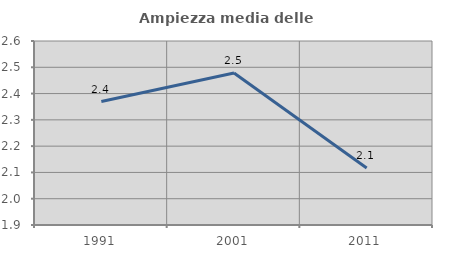
| Category | Ampiezza media delle famiglie |
|---|---|
| 1991.0 | 2.37 |
| 2001.0 | 2.478 |
| 2011.0 | 2.117 |